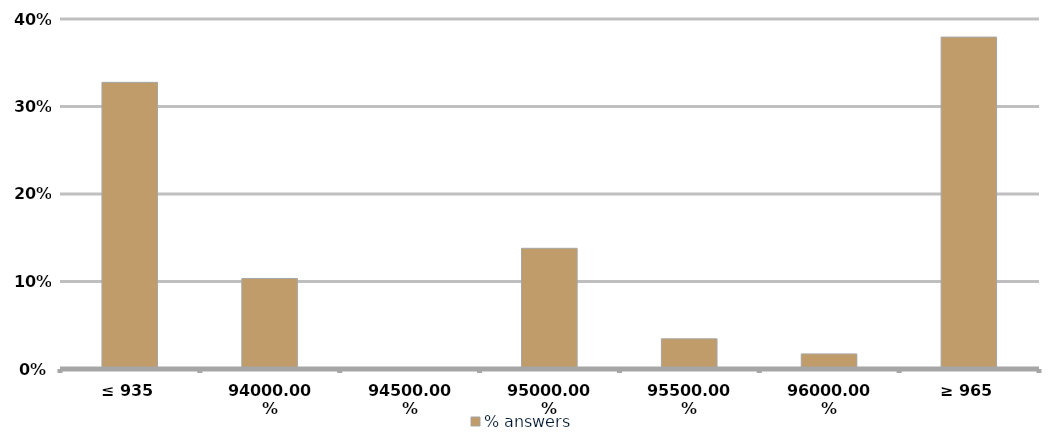
| Category | % answers |
|---|---|
| ≤ 935 | 0.328 |
| 940 | 0.103 |
| 945 | 0 |
| 950 | 0.138 |
| 955 | 0.034 |
| 960 | 0.017 |
| ≥ 965 | 0.379 |